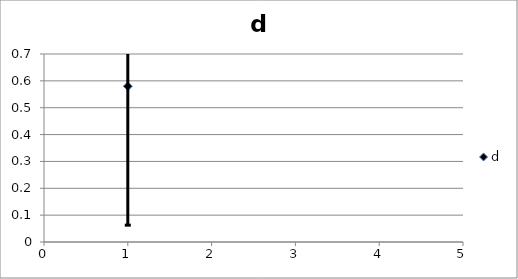
| Category | d |
|---|---|
| 1.0 | 0.58 |